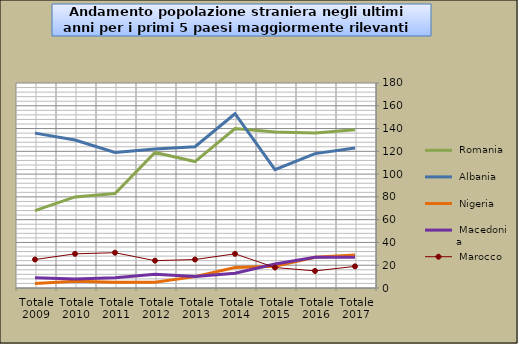
| Category |  Romania  |  Albania  |  Nigeria  |  Macedonia  |  Marocco  |
|---|---|---|---|---|---|
| Totale 2017 | 139 | 123 | 29 | 27 | 19 |
| Totale 2016 | 136 | 118 | 27 | 27 | 15 |
| Totale 2015 | 137 | 104 | 19 | 21 | 18 |
| Totale 2014 | 140 | 153 | 18 | 13 | 30 |
| Totale 2013 | 111 | 124 | 10 | 10 | 25 |
| Totale 2012 | 119 | 122 | 5 | 12 | 24 |
| Totale 2011 | 83 | 119 | 5 | 9 | 31 |
| Totale 2010 | 80 | 130 | 6 | 8 | 30 |
| Totale 2009 | 68 | 136 | 4 | 9 | 25 |